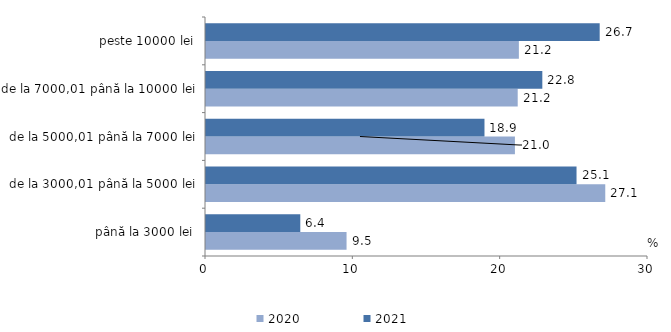
| Category | 2020 | 2021 |
|---|---|---|
| până la 3000 lei | 9.54 | 6.4 |
| de la 3000,01 până la 5000 lei | 27.099 | 25.15 |
| de la 5000,01 până la 7000 lei | 20.968 | 18.902 |
| de la 7000,01 până la 10000 lei | 21.156 | 22.827 |
| peste 10000 lei | 21.236 | 26.721 |